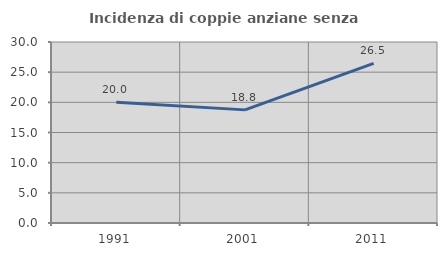
| Category | Incidenza di coppie anziane senza figli  |
|---|---|
| 1991.0 | 20 |
| 2001.0 | 18.75 |
| 2011.0 | 26.471 |